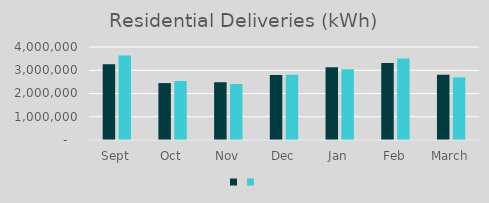
| Category | Series 1 | Series 0 |
|---|---|---|
| Sept | 3255766 | 3631455 |
| Oct | 2448610 | 2538922 |
| Nov | 2484917 | 2405818 |
| Dec | 2793607 | 2803771 |
| Jan | 3124442 | 3040217 |
| Feb | 3307618 | 3510451 |
| March | 2805250 | 2696163 |